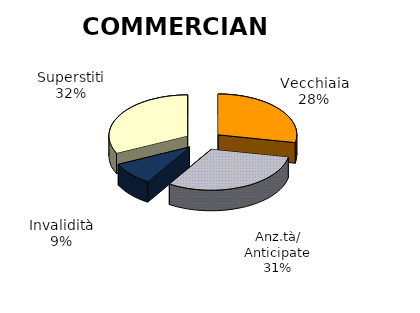
| Category | Series 0 |
|---|---|
| Vecchiaia | 15609 |
| Anz.tà/ Anticipate | 17133 |
| Invalidità | 5055 |
| Superstiti | 17783 |